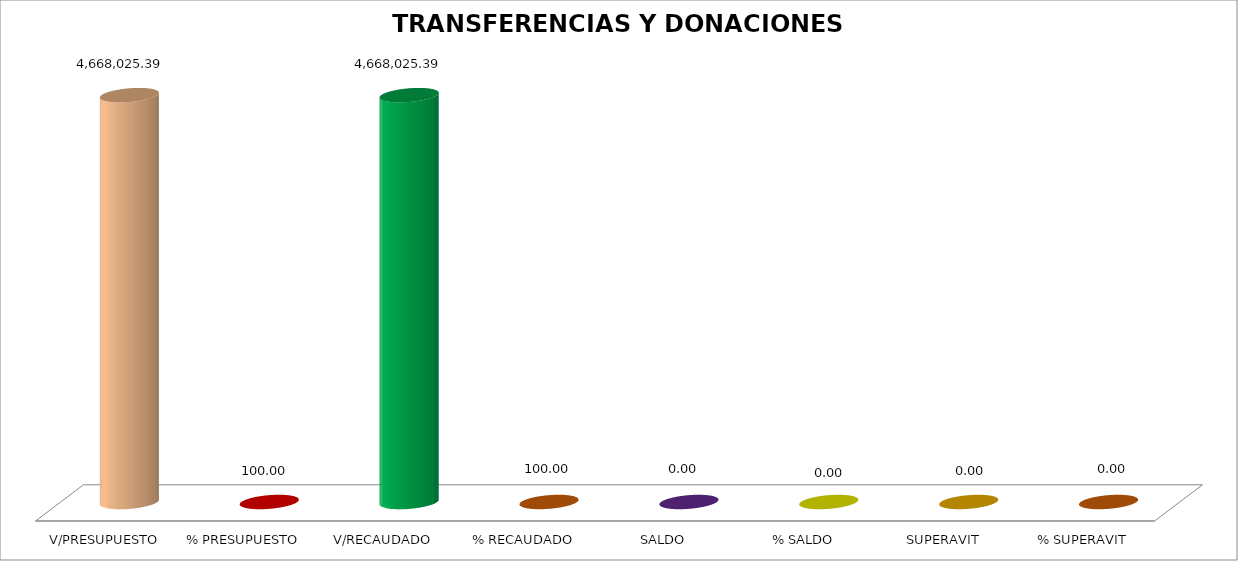
| Category | TRANSFERENCIAS Y DONACIONES CORRIENTES |
|---|---|
| V/PRESUPUESTO | 4668025.39 |
| % PRESUPUESTO | 100 |
| V/RECAUDADO | 4668025.39 |
| % RECAUDADO | 100 |
| SALDO | 0 |
| % SALDO | 0 |
| SUPERAVIT | 0 |
| % SUPERAVIT | 0 |